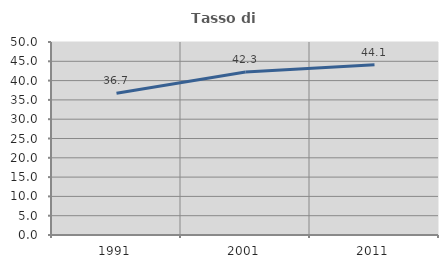
| Category | Tasso di occupazione   |
|---|---|
| 1991.0 | 36.709 |
| 2001.0 | 42.254 |
| 2011.0 | 44.118 |